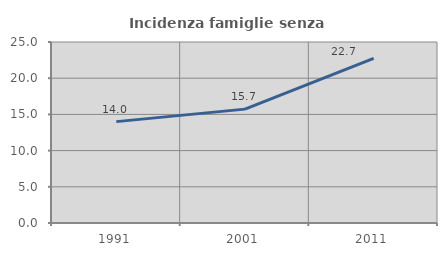
| Category | Incidenza famiglie senza nuclei |
|---|---|
| 1991.0 | 14.002 |
| 2001.0 | 15.728 |
| 2011.0 | 22.746 |